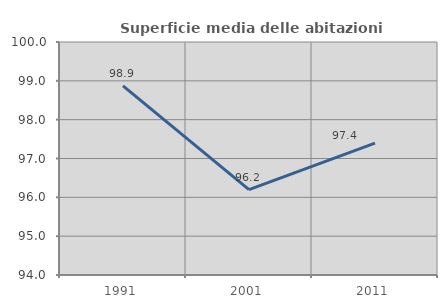
| Category | Superficie media delle abitazioni occupate |
|---|---|
| 1991.0 | 98.871 |
| 2001.0 | 96.199 |
| 2011.0 | 97.397 |